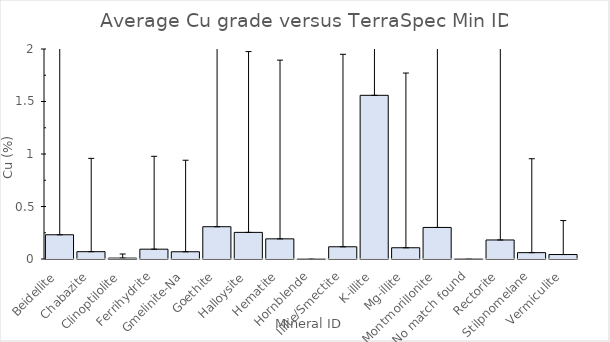
| Category | Average of Cu_Best_pct |
|---|---|
| Beidellite | 0.231 |
| Chabazite | 0.07 |
| Clinoptilolite | 0.009 |
| Ferrihydrite | 0.093 |
| Gmelinite-Na | 0.069 |
| Goethite | 0.307 |
| Halloysite | 0.254 |
| Hematite | 0.192 |
| Hornblende | 0 |
| Illite/Smectite | 0.116 |
| K-illite | 1.559 |
| Mg-illite | 0.107 |
| Montmorillonite | 0.3 |
| No match found | 0.001 |
| Rectorite | 0.181 |
| Stilpnomelane | 0.06 |
| Vermiculite | 0.043 |